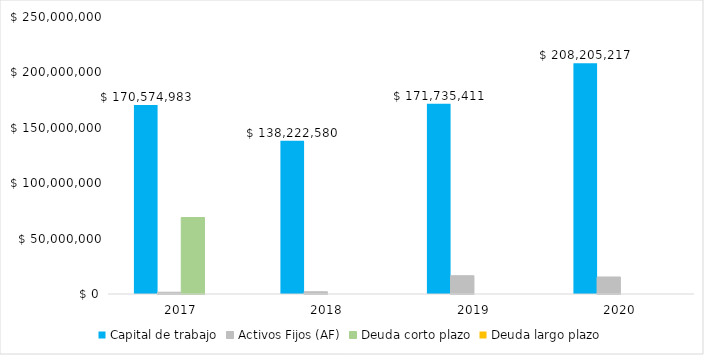
| Category |  Capital de trabajo  |  Activos Fijos (AF)  |  Deuda corto plazo  |  Deuda largo plazo  |
|---|---|---|---|---|
| 2017.0 | 170574983 | 1599466 | 69033092 | 0 |
| 2018.0 | 138222580 | 2033015 | 0 | 0 |
| 2019.0 | 171735411 | 16499983 | 0 | 0 |
| 2020.0 | 208205217 | 15362598 | 0 | 0 |